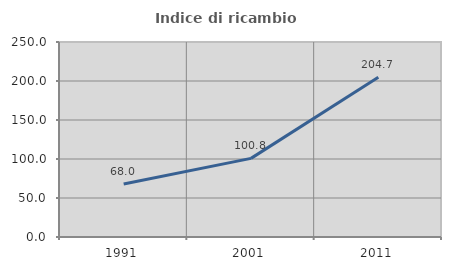
| Category | Indice di ricambio occupazionale  |
|---|---|
| 1991.0 | 68.037 |
| 2001.0 | 100.806 |
| 2011.0 | 204.743 |